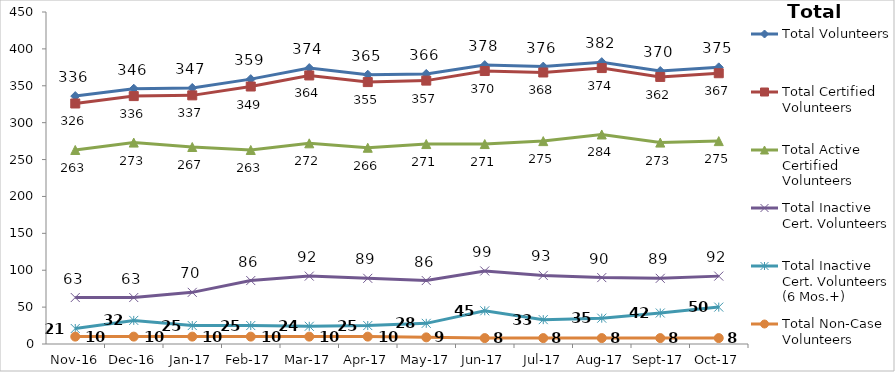
| Category | Total Volunteers | Total Certified Volunteers | Total Active Certified Volunteers | Total Inactive Cert. Volunteers | Total Inactive Cert. Volunteers (6 Mos.+) | Total Non-Case Volunteers |
|---|---|---|---|---|---|---|
| 2016-11-01 | 336 | 326 | 263 | 63 | 21 | 10 |
| 2016-12-01 | 346 | 336 | 273 | 63 | 32 | 10 |
| 2017-01-01 | 347 | 337 | 267 | 70 | 25 | 10 |
| 2017-02-01 | 359 | 349 | 263 | 86 | 25 | 10 |
| 2017-03-01 | 374 | 364 | 272 | 92 | 24 | 10 |
| 2017-04-01 | 365 | 355 | 266 | 89 | 25 | 10 |
| 2017-05-01 | 366 | 357 | 271 | 86 | 28 | 9 |
| 2017-06-01 | 378 | 370 | 271 | 99 | 45 | 8 |
| 2017-07-01 | 376 | 368 | 275 | 93 | 33 | 8 |
| 2017-08-01 | 382 | 374 | 284 | 90 | 35 | 8 |
| 2017-09-01 | 370 | 362 | 273 | 89 | 42 | 8 |
| 2017-10-01 | 375 | 367 | 275 | 92 | 50 | 8 |